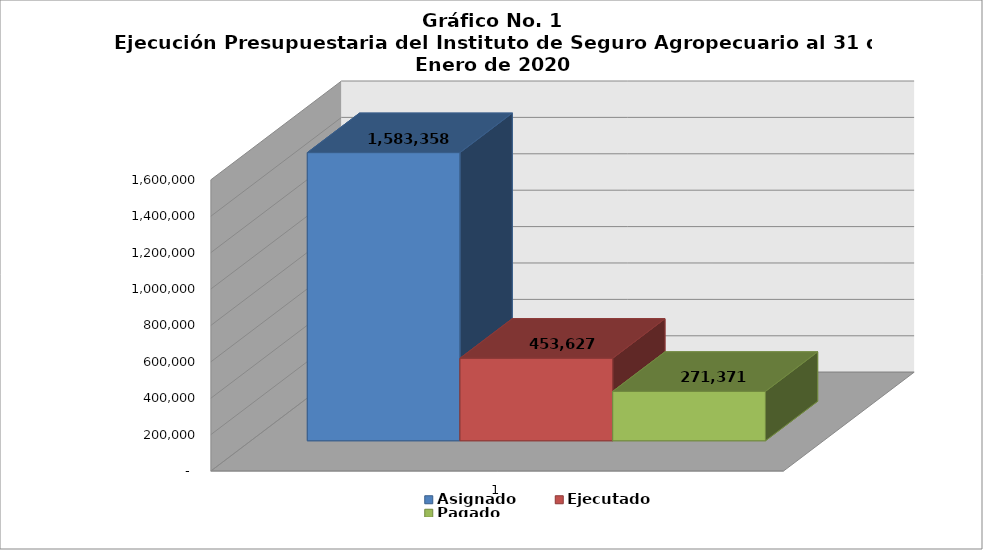
| Category | Asignado | Ejecutado | Pagado |
|---|---|---|---|
| 0 | 1583358 | 453627 | 271371 |